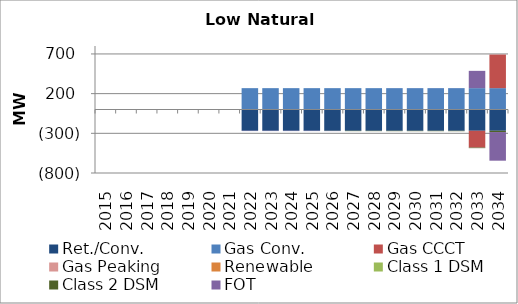
| Category | Ret./Conv. | Gas Conv. | Gas CCCT | Gas Peaking | Renewable | Class 1 DSM | Class 2 DSM | FOT |
|---|---|---|---|---|---|---|---|---|
| 2015.0 | 0 | 0 | 0 | 0 | 0 | 0 | 0 | 0 |
| 2016.0 | 0 | 0 | 0 | 0 | 0 | 0 | 0 | 0 |
| 2017.0 | 0 | 0 | 0 | 0 | 0 | 0 | 0 | 0 |
| 2018.0 | 0 | 0 | 0 | 0 | 0 | 0 | 0 | 0 |
| 2019.0 | 0 | 0 | 0 | 0 | 0 | 0 | 0 | -2.273 |
| 2020.0 | 0 | 0 | 0 | 0 | 0 | 0 | 0 | -2.735 |
| 2021.0 | 0 | 0 | 0 | 0 | 0 | 0 | 0 | -2.735 |
| 2022.0 | -268 | 269 | 0 | 0 | 0 | 0 | 0 | -3.679 |
| 2023.0 | -268 | 269 | 0 | 0 | 0 | 0 | 0.19 | -3.819 |
| 2024.0 | -268 | 269 | 0 | 0 | 0 | 0 | 0.19 | -3.82 |
| 2025.0 | -268 | 269 | 0 | 0 | 0 | 0 | 0.19 | -3.82 |
| 2026.0 | -268 | 269 | 0 | 0 | 0 | 0 | -1.81 | -2.308 |
| 2027.0 | -268 | 269 | 0 | 0 | 0 | 0 | -4.71 | 0.041 |
| 2028.0 | -268 | 269 | 0 | 0 | 0 | 0 | -4.84 | 0.122 |
| 2029.0 | -268 | 269 | 0 | 0 | 0 | 0 | -5.25 | 0.43 |
| 2030.0 | -268 | 269 | 0 | 0 | 0 | 0 | -5.25 | 0.422 |
| 2031.0 | -268 | 269 | 0 | 0 | 0 | 0 | -5.56 | 0.668 |
| 2032.0 | -268 | 269 | 0 | 0 | 0 | 0 | -5.56 | 0.669 |
| 2033.0 | -268 | 269 | -212 | 0 | 0 | 0 | -6.86 | 217.898 |
| 2034.0 | -268 | 269 | 423 | 0 | 0 | 0 | -16.13 | -360.771 |